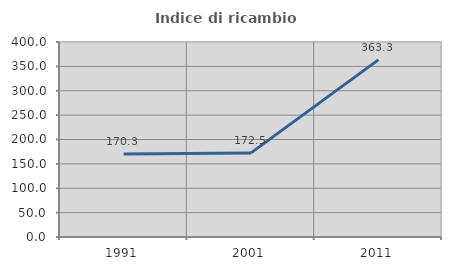
| Category | Indice di ricambio occupazionale  |
|---|---|
| 1991.0 | 170.27 |
| 2001.0 | 172.5 |
| 2011.0 | 363.333 |